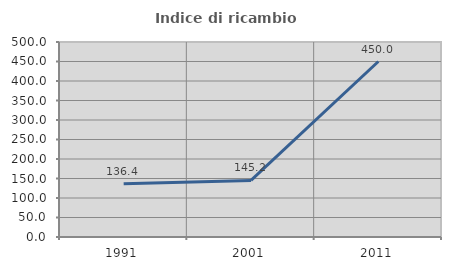
| Category | Indice di ricambio occupazionale  |
|---|---|
| 1991.0 | 136.364 |
| 2001.0 | 145.161 |
| 2011.0 | 450 |